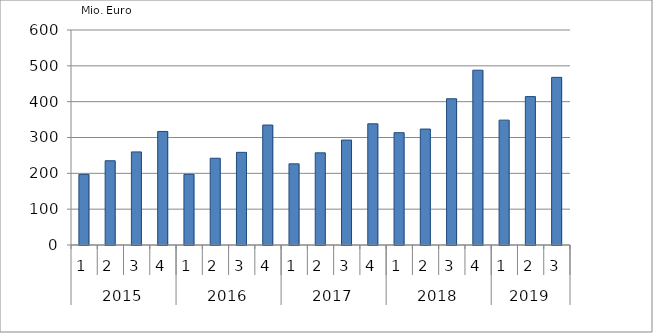
| Category | Ausbaugewerblicher Umsatz3 |
|---|---|
| 0 | 197030.42 |
| 1 | 235094.994 |
| 2 | 259758.438 |
| 3 | 316833.232 |
| 4 | 197219.532 |
| 5 | 242069.899 |
| 6 | 258547.84 |
| 7 | 334764.305 |
| 8 | 226552.317 |
| 9 | 257191.13 |
| 10 | 292853.372 |
| 11 | 338154.691 |
| 12 | 313433.569 |
| 13 | 323547.694 |
| 14 | 408057.42 |
| 15 | 487843.765 |
| 16 | 348466.115 |
| 17 | 414145.554 |
| 18 | 467849.207 |